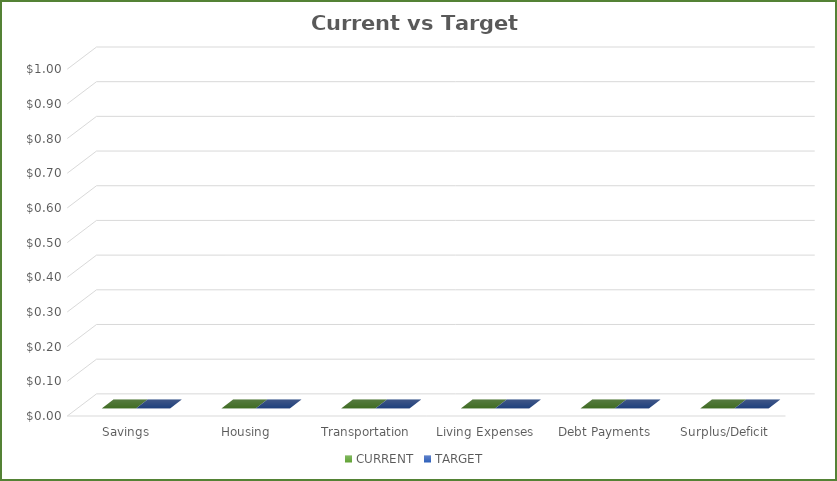
| Category | CURRENT | TARGET |
|---|---|---|
| Savings | 0 | 0 |
| Housing | 0 | 0 |
| Transportation | 0 | 0 |
| Living Expenses | 0 | 0 |
| Debt Payments | 0 | 0 |
| Surplus/Deficit | 0 | 0 |